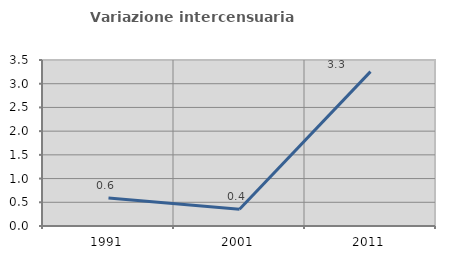
| Category | Variazione intercensuaria annua |
|---|---|
| 1991.0 | 0.588 |
| 2001.0 | 0.353 |
| 2011.0 | 3.255 |